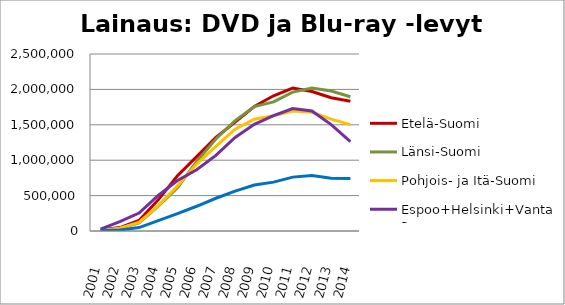
| Category | Etelä-Suomi | Länsi-Suomi | Pohjois- ja Itä-Suomi | Espoo+Helsinki+Vantaa | Muu Uusimaa |
|---|---|---|---|---|---|
| 2001.0 | 13976 | 8034 | 8688 | 26198 | 2549 |
| 2002.0 | 48271 | 38781 | 38205 | 132041 | 13185 |
| 2003.0 | 148071 | 116155 | 120303 | 253381 | 48575 |
| 2004.0 | 440081 | 350679 | 357364 | 501839 | 145816 |
| 2005.0 | 779573 | 612134 | 637601 | 712978 | 245800 |
| 2006.0 | 1051088 | 981393 | 945254 | 866054 | 349307 |
| 2007.0 | 1320894 | 1299201 | 1195365 | 1068143 | 462585 |
| 2008.0 | 1538302 | 1559106 | 1437928 | 1321645 | 564091 |
| 2009.0 | 1758232 | 1756931 | 1579212 | 1506317 | 649944 |
| 2010.0 | 1910290 | 1823965 | 1627512 | 1628395 | 690490 |
| 2011.0 | 2019743 | 1961416 | 1694798 | 1728396 | 761108 |
| 2012.0 | 1970877 | 2020920 | 1677024 | 1696062 | 782245 |
| 2013.0 | 1882726 | 1976659 | 1579659 | 1503112 | 746619 |
| 2014.0 | 1832507 | 1896467 | 1502484 | 1263394 | 742643 |